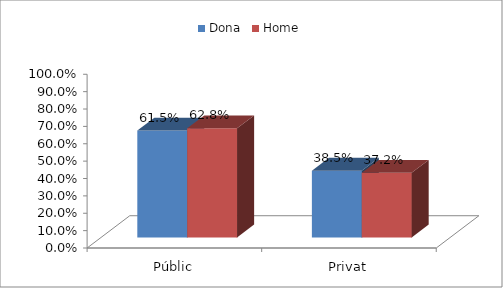
| Category | Dona | Home |
|---|---|---|
| Públic | 0.615 | 0.628 |
| Privat | 0.385 | 0.372 |